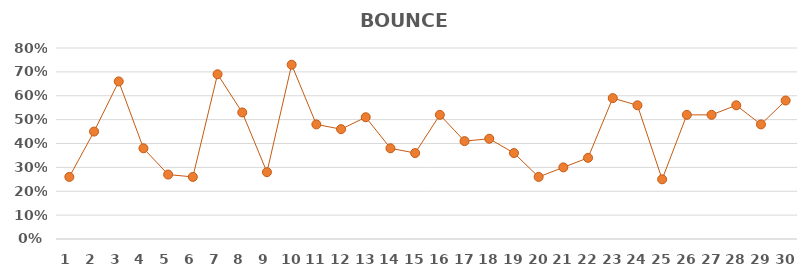
| Category | BOUNCE RATE |
|---|---|
| 1.0 | 0.26 |
| 2.0 | 0.45 |
| 3.0 | 0.66 |
| 4.0 | 0.38 |
| 5.0 | 0.27 |
| 6.0 | 0.26 |
| 7.0 | 0.69 |
| 8.0 | 0.53 |
| 9.0 | 0.28 |
| 10.0 | 0.73 |
| 11.0 | 0.48 |
| 12.0 | 0.46 |
| 13.0 | 0.51 |
| 14.0 | 0.38 |
| 15.0 | 0.36 |
| 16.0 | 0.52 |
| 17.0 | 0.41 |
| 18.0 | 0.42 |
| 19.0 | 0.36 |
| 20.0 | 0.26 |
| 21.0 | 0.3 |
| 22.0 | 0.34 |
| 23.0 | 0.59 |
| 24.0 | 0.56 |
| 25.0 | 0.25 |
| 26.0 | 0.52 |
| 27.0 | 0.52 |
| 28.0 | 0.56 |
| 29.0 | 0.48 |
| 30.0 | 0.58 |